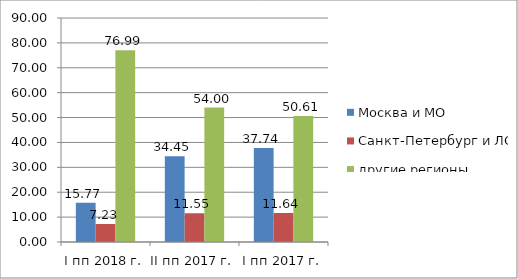
| Category | Москва и МО | Санкт-Петербург и ЛО | другие регионы |
|---|---|---|---|
| I пп 2018 г. | 15.772 | 7.234 | 76.995 |
| II пп 2017 г. | 34.447 | 11.549 | 54.004 |
| I пп 2017 г. | 37.743 | 11.645 | 50.613 |